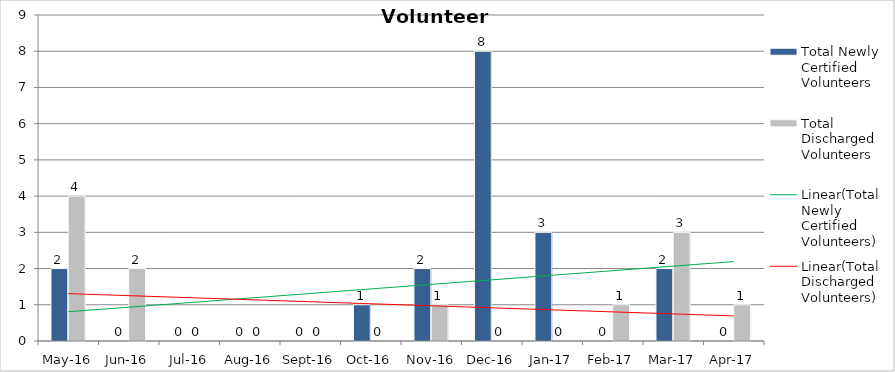
| Category | Total Newly Certified Volunteers | Total Discharged Volunteers |
|---|---|---|
| May-16 | 2 | 4 |
| Jun-16 | 0 | 2 |
| Jul-16 | 0 | 0 |
| Aug-16 | 0 | 0 |
| Sep-16 | 0 | 0 |
| Oct-16 | 1 | 0 |
| Nov-16 | 2 | 1 |
| Dec-16 | 8 | 0 |
| Jan-17 | 3 | 0 |
| Feb-17 | 0 | 1 |
| Mar-17 | 2 | 3 |
| Apr-17 | 0 | 1 |